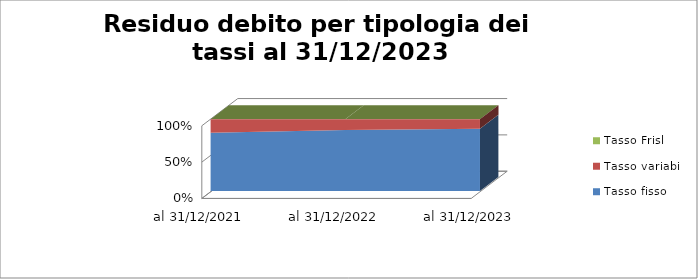
| Category | Tasso fisso | Tasso variabile | Tasso Frisl |
|---|---|---|---|
| al 31/12/2021 | 2989.142 | 692.054 | 1.554 |
| al 31/12/2022 | 3067.626 | 531.57 | 1.35 |
| al 31/12/2023 | 2988.272 | 449.48 | 1.147 |